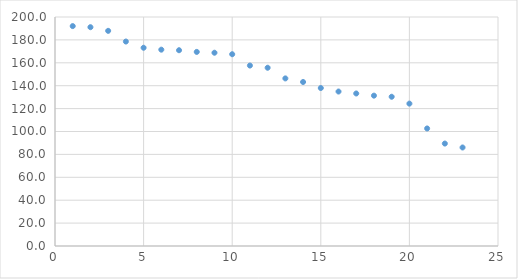
| Category | Series 0 |
|---|---|
| 1.0 | 192.052 |
| 2.0 | 191.101 |
| 3.0 | 187.904 |
| 4.0 | 178.574 |
| 5.0 | 173.143 |
| 6.0 | 171.469 |
| 7.0 | 170.976 |
| 8.0 | 169.516 |
| 9.0 | 168.793 |
| 10.0 | 167.497 |
| 11.0 | 157.593 |
| 12.0 | 155.686 |
| 13.0 | 146.375 |
| 14.0 | 143.233 |
| 15.0 | 137.968 |
| 16.0 | 134.904 |
| 17.0 | 133.202 |
| 18.0 | 131.313 |
| 19.0 | 130.339 |
| 20.0 | 124.352 |
| 21.0 | 102.649 |
| 22.0 | 89.47 |
| 23.0 | 86.04 |